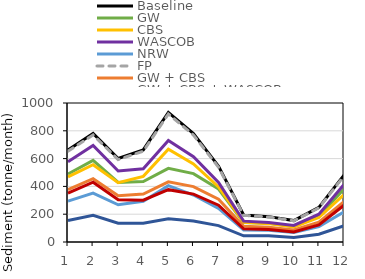
| Category | Baseline | GW | CBS | WASCOB | NRW | FP | GW + CBS | GW + CBS + WASCOB | All ACPs |
|---|---|---|---|---|---|---|---|---|---|
| 1.0 | 662.523 | 489.545 | 468.217 | 577.032 | 293.578 | 653.191 | 377.583 | 351.798 | 154.955 |
| 2.0 | 780.886 | 586.851 | 556.402 | 694.324 | 351.392 | 770.181 | 455.067 | 430.357 | 191.6 |
| 3.0 | 600.642 | 428.751 | 426.361 | 510.895 | 267.924 | 592.898 | 332.528 | 304.242 | 135.247 |
| 4.0 | 662.521 | 435.24 | 472.095 | 526.751 | 293.474 | 653.389 | 344.615 | 300.78 | 134.673 |
| 5.0 | 932.654 | 529.699 | 668.029 | 730.539 | 405.323 | 920.839 | 432.568 | 376.479 | 167.349 |
| 6.0 | 779.832 | 491.728 | 561.229 | 613.184 | 338.113 | 769.137 | 398.223 | 344.619 | 151.303 |
| 7.0 | 545.416 | 381.273 | 396.203 | 429.089 | 242.129 | 537.746 | 307.757 | 264.963 | 117.668 |
| 8.0 | 194.279 | 140.791 | 142.011 | 150.126 | 87.115 | 191.856 | 112.88 | 95.317 | 44.202 |
| 9.0 | 182.44 | 134.446 | 132.102 | 140.353 | 84.809 | 179.913 | 106.338 | 89.927 | 44.118 |
| 10.0 | 154.16 | 112.461 | 107.356 | 119.111 | 68.167 | 152.088 | 86.161 | 71.952 | 32.216 |
| 11.0 | 248.98 | 185.65 | 175.849 | 200.129 | 111.012 | 245.621 | 142.93 | 123.412 | 55.572 |
| 12.0 | 481.467 | 381.723 | 341.075 | 413.722 | 215.741 | 474.854 | 290.773 | 264.767 | 116.816 |